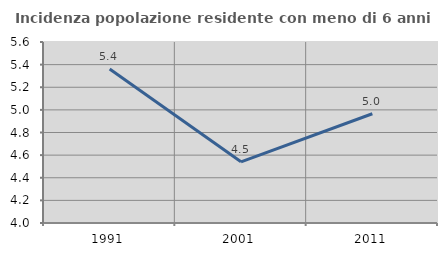
| Category | Incidenza popolazione residente con meno di 6 anni |
|---|---|
| 1991.0 | 5.361 |
| 2001.0 | 4.541 |
| 2011.0 | 4.966 |